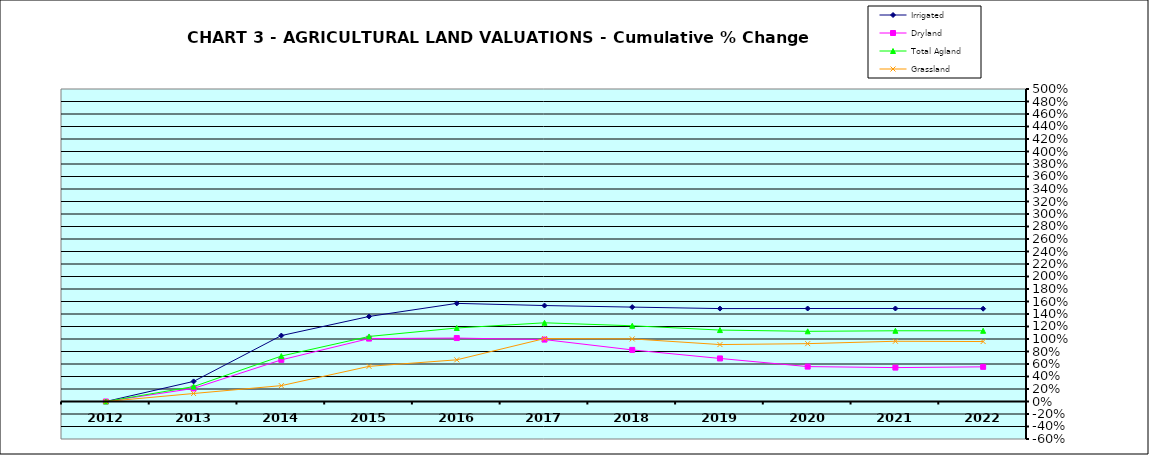
| Category | Irrigated | Dryland | Total Agland | Grassland |
|---|---|---|---|---|
| 2012.0 | 0 | 0 | 0 | 0 |
| 2013.0 | 0.321 | 0.209 | 0.238 | 0.128 |
| 2014.0 | 1.055 | 0.666 | 0.727 | 0.254 |
| 2015.0 | 1.361 | 1.007 | 1.041 | 0.562 |
| 2016.0 | 1.57 | 1.015 | 1.176 | 0.667 |
| 2017.0 | 1.535 | 0.991 | 1.259 | 1.007 |
| 2018.0 | 1.51 | 0.825 | 1.212 | 1.002 |
| 2019.0 | 1.487 | 0.689 | 1.143 | 0.911 |
| 2020.0 | 1.488 | 0.558 | 1.123 | 0.926 |
| 2021.0 | 1.488 | 0.542 | 1.132 | 0.964 |
| 2022.0 | 1.485 | 0.554 | 1.131 | 0.959 |